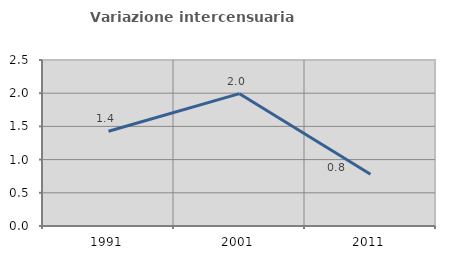
| Category | Variazione intercensuaria annua |
|---|---|
| 1991.0 | 1.427 |
| 2001.0 | 1.993 |
| 2011.0 | 0.78 |